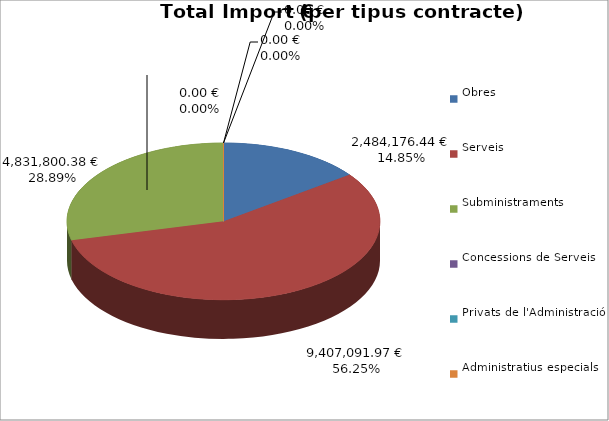
| Category | Total preu
(amb IVA) |
|---|---|
| Obres | 2484176.44 |
| Serveis | 9407091.97 |
| Subministraments | 4831800.38 |
| Concessions de Serveis | 0 |
| Privats de l'Administració | 0 |
| Administratius especials | 0 |